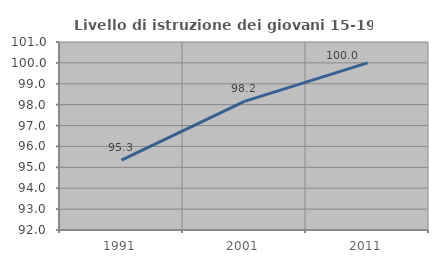
| Category | Livello di istruzione dei giovani 15-19 anni |
|---|---|
| 1991.0 | 95.349 |
| 2001.0 | 98.16 |
| 2011.0 | 100 |